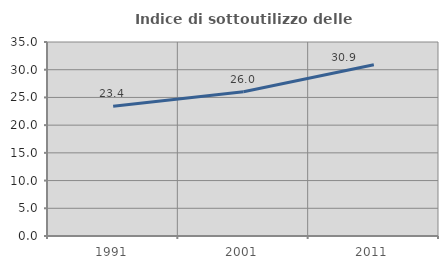
| Category | Indice di sottoutilizzo delle abitazioni  |
|---|---|
| 1991.0 | 23.39 |
| 2001.0 | 26.017 |
| 2011.0 | 30.905 |